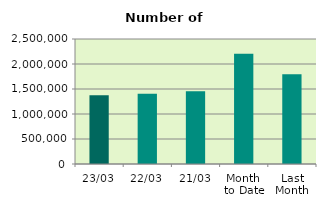
| Category | Series 0 |
|---|---|
| 23/03 | 1372664 |
| 22/03 | 1406862 |
| 21/03 | 1452732 |
| Month 
to Date | 2207187.412 |
| Last
Month | 1795830.8 |